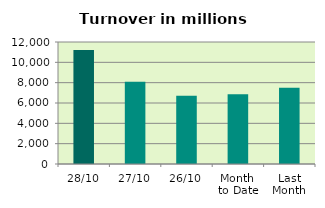
| Category | Series 0 |
|---|---|
| 28/10 | 11208.566 |
| 27/10 | 8080.384 |
| 26/10 | 6721.491 |
| Month 
to Date | 6849.453 |
| Last
Month | 7507.246 |